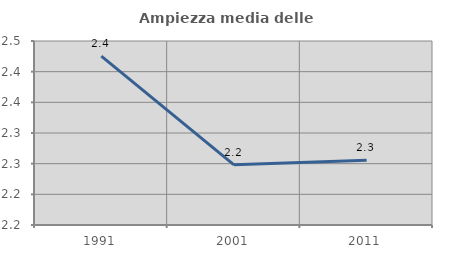
| Category | Ampiezza media delle famiglie |
|---|---|
| 1991.0 | 2.425 |
| 2001.0 | 2.248 |
| 2011.0 | 2.255 |